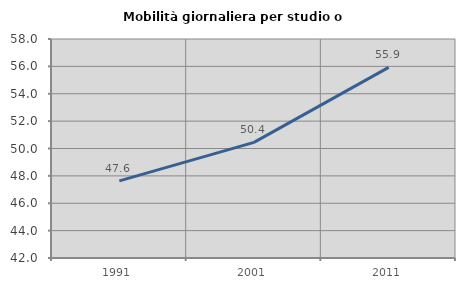
| Category | Mobilità giornaliera per studio o lavoro |
|---|---|
| 1991.0 | 47.632 |
| 2001.0 | 50.445 |
| 2011.0 | 55.925 |